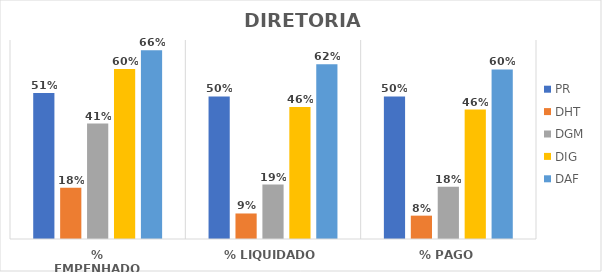
| Category | PR | DHT | DGM | DIG | DAF |
|---|---|---|---|---|---|
| % EMPENHADO | 0.513 | 0.18 | 0.406 | 0.598 | 0.664 |
| % LIQUIDADO | 0.502 | 0.09 | 0.192 | 0.464 | 0.615 |
| % PAGO | 0.501 | 0.082 | 0.184 | 0.455 | 0.597 |